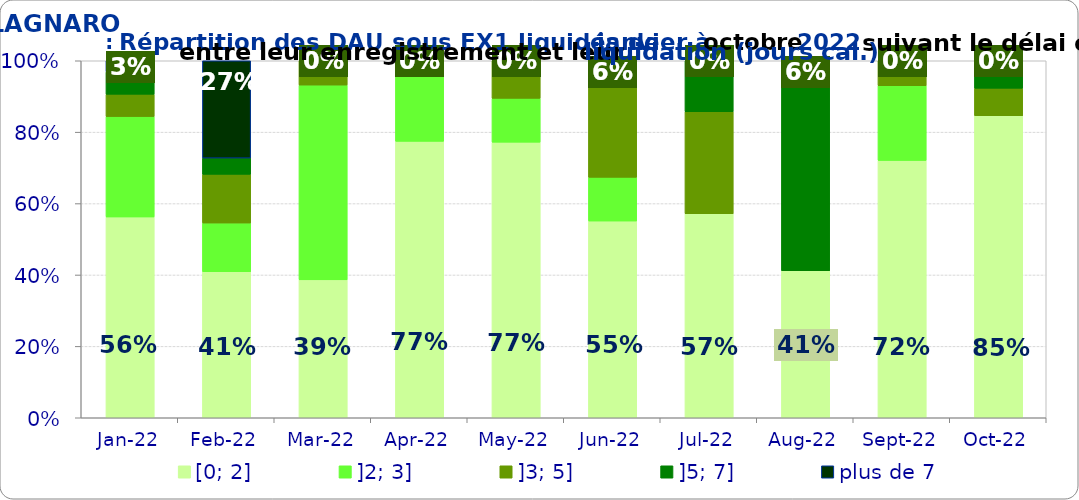
| Category | [0; 2] | ]2; 3] | ]3; 5] | ]5; 7] | plus de 7 |
|---|---|---|---|---|---|
| 2022-01-01 | 0.562 | 0.281 | 0.062 | 0.062 | 0.031 |
| 2022-02-01 | 0.409 | 0.136 | 0.136 | 0.045 | 0.273 |
| 2022-03-01 | 0.386 | 0.545 | 0.068 | 0 | 0 |
| 2022-04-01 | 0.774 | 0.194 | 0 | 0.032 | 0 |
| 2022-05-01 | 0.772 | 0.123 | 0.105 | 0 | 0 |
| 2022-06-01 | 0.551 | 0.122 | 0.265 | 0 | 0.061 |
| 2022-07-01 | 0.571 | 0 | 0.286 | 0.143 | 0 |
| 2022-08-01 | 0.412 | 0 | 0 | 0.529 | 0.059 |
| 2022-09-01 | 0.721 | 0.209 | 0.07 | 0 | 0 |
| 2022-10-01 | 0.846 | 0 | 0.077 | 0.077 | 0 |